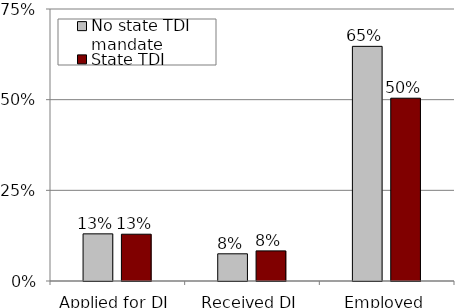
| Category | No state TDI mandate | State TDI mandate |
|---|---|---|
| Applied for DI | 0.13 | 0.129 |
| Received DI | 0.075 | 0.083 |
| Employed | 0.647 | 0.504 |